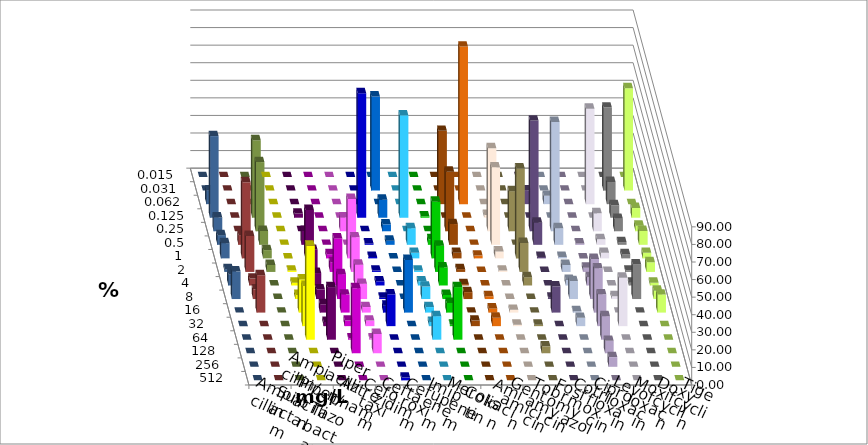
| Category | Ampicillin | Ampicillin/ Sulbactam | Piperacillin | Piperacillin/ Tazobactam | Aztreonam | Cefotaxim | Ceftazidim | Cefuroxim | Imipenem | Meropenem | Colistin | Amikacin | Gentamicin | Tobramycin | Fosfomycin | Cotrimoxazol | Ciprofloxacin | Levofloxacin | Moxifloxacin | Doxycyclin | Tigecyclin |
|---|---|---|---|---|---|---|---|---|---|---|---|---|---|---|---|---|---|---|---|---|---|
| 0.015 | 0 | 0 | 0 | 0 | 0 | 0 | 0 | 0 | 0 | 0 | 0 | 0 | 0 | 0 | 0 | 0 | 0 | 0 | 0 | 0 | 0 |
| 0.031 | 0 | 0 | 0 | 0 | 0 | 53.543 | 0 | 0 | 0 | 0 | 0 | 0 | 0 | 0 | 0 | 0 | 47.244 | 58.268 | 0 | 0 | 0 |
| 0.062 | 0 | 0 | 0 | 0 | 0 | 0 | 0 | 0 | 41.732 | 89.683 | 0 | 0 | 7.874 | 4.724 | 0 | 54.331 | 12.598 | 0 | 7.874 | 0 | 0 |
| 0.125 | 0 | 2.362 | 0 | 0 | 70.866 | 10.236 | 58.268 | 0.787 | 0 | 0 | 1.575 | 0 | 0 | 0 | 0 | 0 | 7.087 | 5.512 | 46.457 | 0 | 44.094 |
| 0.25 | 0 | 0 | 0 | 7.874 | 0 | 3.937 | 0 | 0 | 33.858 | 0 | 47.244 | 22.835 | 62.992 | 62.205 | 0 | 10.236 | 7.087 | 3.15 | 7.874 | 0 | 39.37 |
| 0.5 | 0 | 7.874 | 0 | 0 | 0.787 | 2.362 | 9.449 | 3.15 | 11.811 | 0 | 44.094 | 0 | 12.598 | 9.449 | 0.787 | 3.15 | 1.575 | 7.874 | 5.512 | 5.512 | 7.874 |
| 1.0 | 0 | 27.559 | 2.362 | 33.858 | 0.787 | 0 | 3.15 | 32.283 | 3.15 | 1.587 | 3.937 | 51.181 | 0.787 | 0.787 | 0 | 3.15 | 2.362 | 3.15 | 8.661 | 43.307 | 4.724 |
| 2.0 | 0.787 | 12.598 | 5.512 | 19.685 | 0.787 | 0 | 0.787 | 14.961 | 1.575 | 0 | 0.787 | 16.535 | 0 | 3.937 | 2.362 | 0 | 0.787 | 5.512 | 1.575 | 20.472 | 3.937 |
| 4.0 | 1.575 | 7.087 | 26.772 | 11.811 | 2.362 | 0 | 2.362 | 10.236 | 0.787 | 0 | 0 | 4.724 | 0 | 3.15 | 4.724 | 0 | 1.575 | 1.575 | 6.299 | 3.937 | 0 |
| 8.0 | 2.362 | 5.512 | 14.173 | 8.661 | 0.787 | 0 | 7.087 | 2.362 | 3.937 | 1.587 | 0 | 0 | 0.787 | 10.236 | 22.835 | 1.575 | 19.685 | 4.724 | 15.748 | 5.512 | 0 |
| 16.0 | 18.898 | 4.724 | 10.236 | 3.15 | 3.937 | 29.921 | 3.15 | 5.512 | 0 | 2.381 | 1.575 | 0 | 14.961 | 0.787 | 25.197 | 0 | 0 | 10.236 | 0 | 21.26 | 0 |
| 32.0 | 22.835 | 2.362 | 3.15 | 3.15 | 18.11 | 0 | 2.362 | 0.787 | 3.15 | 4.762 | 0.787 | 0.787 | 0 | 4.724 | 18.11 | 27.559 | 0 | 0 | 0 | 0 | 0 |
| 64.0 | 53.543 | 29.921 | 0.787 | 0.787 | 0 | 0 | 13.386 | 29.921 | 0 | 0 | 0 | 0 | 0 | 0 | 13.386 | 0 | 0 | 0 | 0 | 0 | 0 |
| 128.0 | 0 | 0 | 37.008 | 11.024 | 0 | 0 | 0 | 0 | 0 | 0 | 0 | 3.937 | 0 | 0 | 7.087 | 0 | 0 | 0 | 0 | 0 | 0 |
| 256.0 | 0 | 0 | 0 | 0 | 0 | 0 | 0 | 0 | 0 | 0 | 0 | 0 | 0 | 0 | 5.512 | 0 | 0 | 0 | 0 | 0 | 0 |
| 512.0 | 0 | 0 | 0 | 0 | 1.575 | 0 | 0 | 0 | 0 | 0 | 0 | 0 | 0 | 0 | 0 | 0 | 0 | 0 | 0 | 0 | 0 |